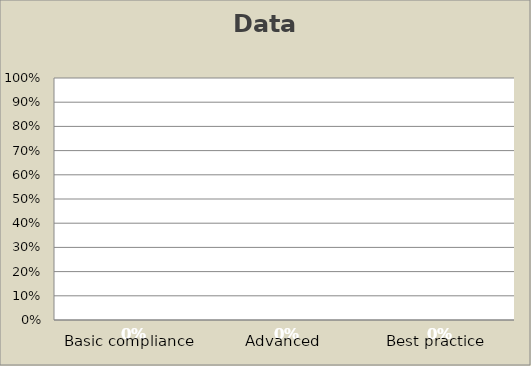
| Category | Data Analysis |
|---|---|
| Basic compliance | 0 |
| Advanced | 0 |
| Best practice | 0 |